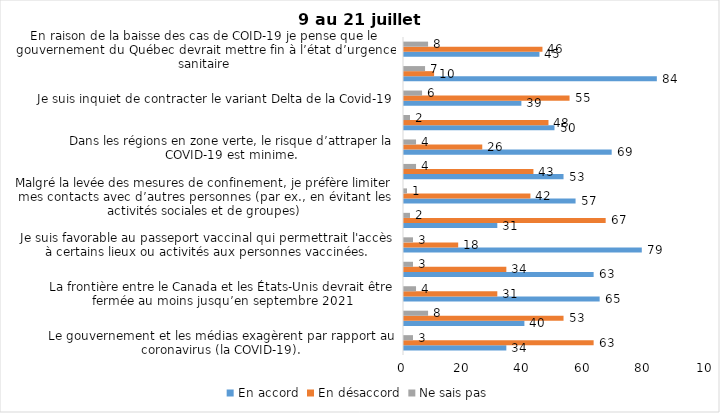
| Category | En accord | En désaccord | Ne sais pas |
|---|---|---|---|
| Le gouvernement et les médias exagèrent par rapport au coronavirus (la COVID-19). | 34 | 63 | 3 |
| J’ai peur que le système de santé soit débordé par les cas de COVID-19 suite au "déconfinement" | 40 | 53 | 8 |
| La frontière entre le Canada et les États-Unis devrait être fermée au moins jusqu’en septembre 2021 | 65 | 31 | 4 |
| Les personnes vaccinées contre la COVID-19 devraient avoir le droit de faire des rassemblements privés et de ne plus porter le masque dans les lieux publics. | 63 | 34 | 3 |
| Je suis favorable au passeport vaccinal qui permettrait l'accès à certains lieux ou activités aux personnes vaccinées. | 79 | 18 | 3 |
| Étant donné la progression de la vaccination et la diminution du nombre de cas de COVID-19, je pense qu’il est moins important de suivre les mesures de prévention. | 31 | 67 | 2 |
| Malgré la levée des mesures de confinement, je préfère limiter mes contacts avec d’autres personnes (par ex., en évitant les activités sociales et de groupes) | 57 | 42 | 1 |
| J’ai peur qu’il y ait une 4e vague de la COVID-19. | 53 | 43 | 4 |
| Dans les régions en zone verte, le risque d’attraper la COVID-19 est minime. | 69 | 26 | 4 |
| Si les cas de COVID-19 augmentent cet automne, je suis favorable à la mise en place de mesures de confinement (ex. fermeture de services non essentiels, interdiction des rassemblements privés) | 50 | 48 | 2 |
| Je suis inquiet de contracter le variant Delta de la Covid-19 | 39 | 55 | 6 |
| Je suis confiant que la vaccination protège efficacement contre les variants de la COVID-19 | 84 | 10 | 7 |
| En raison de la baisse des cas de COID-19 je pense que le gouvernement du Québec devrait mettre fin à l’état d’urgence sanitaire | 45 | 46 | 8 |